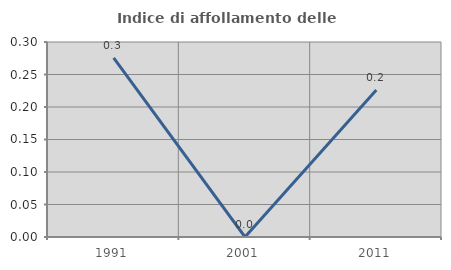
| Category | Indice di affollamento delle abitazioni  |
|---|---|
| 1991.0 | 0.275 |
| 2001.0 | 0 |
| 2011.0 | 0.226 |